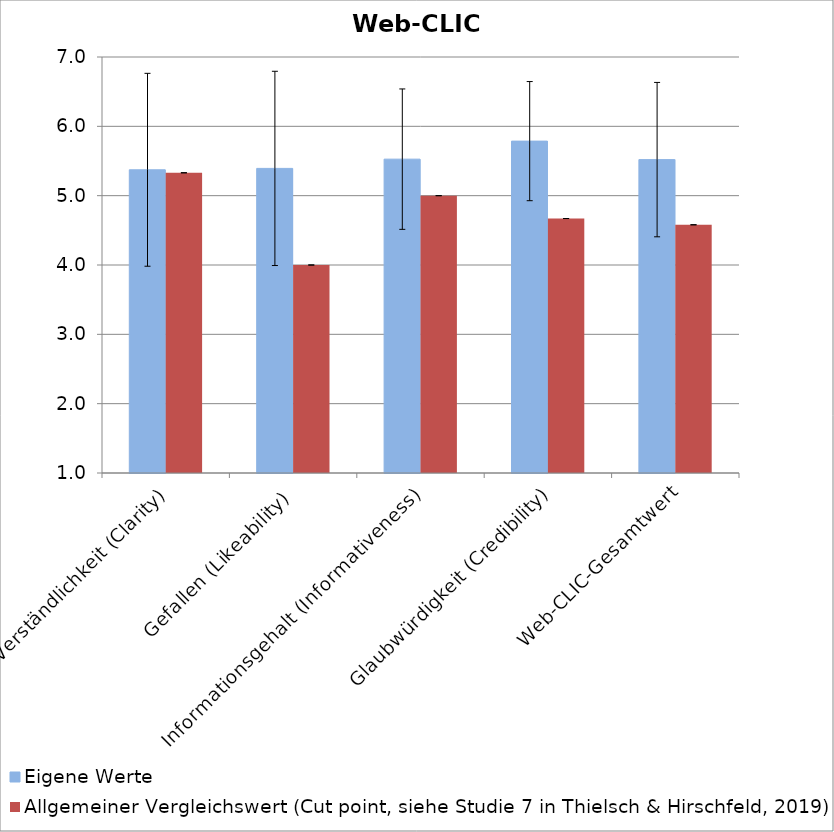
| Category | Eigene Werte | Allgemeiner Vergleichswert (Cut point, siehe Studie 7 in Thielsch & Hirschfeld, 2019) |
|---|---|---|
| Verständlichkeit (Clarity) | 5.373 | 5.33 |
| Gefallen (Likeability) | 5.393 | 4 |
| Informationsgehalt (Informativeness) | 5.527 | 5 |
| Glaubwürdigkeit (Credibility) | 5.787 | 4.67 |
| Web-CLIC-Gesamtwert | 5.52 | 4.58 |